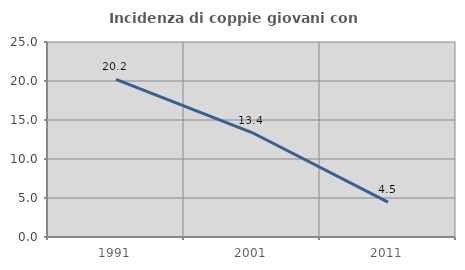
| Category | Incidenza di coppie giovani con figli |
|---|---|
| 1991.0 | 20.202 |
| 2001.0 | 13.393 |
| 2011.0 | 4.464 |